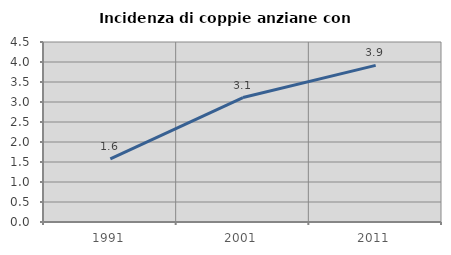
| Category | Incidenza di coppie anziane con figli |
|---|---|
| 1991.0 | 1.579 |
| 2001.0 | 3.111 |
| 2011.0 | 3.916 |